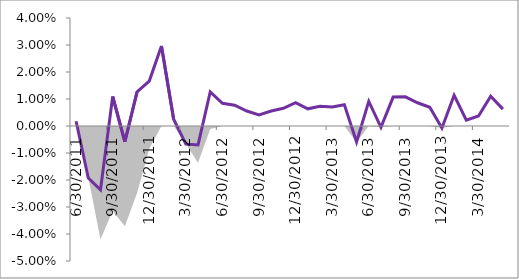
| Category | Series 1 |
|---|---|
| 0 | 0.002 |
| 01/01/1900 | -0.019 |
| 02/01/1900 | -0.024 |
| 03/01/1900 | 0.011 |
| 04/01/1900 | -0.006 |
| 05/01/1900 | 0.013 |
| 06/01/1900 | 0.017 |
| 07/01/1900 | 0.03 |
| 08/01/1900 | 0.002 |
| 09/01/1900 | -0.007 |
| 10/01/1900 | -0.007 |
| 11/01/1900 | 0.013 |
| 12/01/1900 | 0.008 |
| 13/01/1900 | 0.008 |
| 14/01/1900 | 0.006 |
| 15/01/1900 | 0.004 |
| 16/01/1900 | 0.006 |
| 17/01/1900 | 0.007 |
| 18/01/1900 | 0.009 |
| 19/01/1900 | 0.006 |
| 20/01/1900 | 0.007 |
| 21/01/1900 | 0.007 |
| 22/01/1900 | 0.008 |
| 23/01/1900 | -0.006 |
| 24/01/1900 | 0.009 |
| 25/01/1900 | 0 |
| 26/01/1900 | 0.011 |
| 27/01/1900 | 0.011 |
| 28/01/1900 | 0.009 |
| 29/01/1900 | 0.007 |
| 30/01/1900 | -0.001 |
| 31/01/1900 | 0.011 |
| 01/02/1900 | 0.002 |
| 02/02/1900 | 0.004 |
| 03/02/1900 | 0.011 |
| 04/02/1900 | 0.006 |